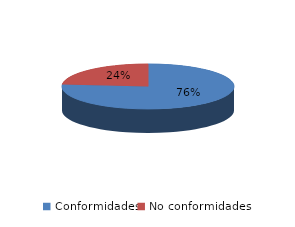
| Category | Series 0 |
|---|---|
| Conformidades | 1446 |
| No conformidades | 447 |